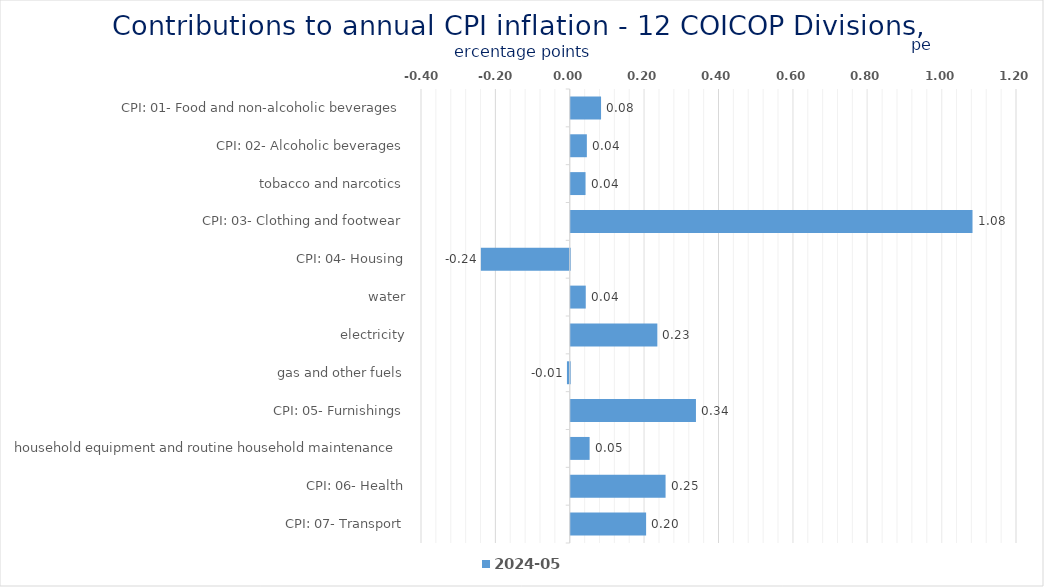
| Category | 2024-05 |
|---|---|
| CPI: 01- Food and non-alcoholic beverages | 0.081 |
| CPI: 02- Alcoholic beverages, tobacco and narcotics | 0.043 |
| CPI: 03- Clothing and footwear | 0.04 |
| CPI: 04- Housing, water, electricity, gas and other fuels | 1.08 |
| CPI: 05- Furnishings, household equipment and routine household maintenance | -0.239 |
| CPI: 06- Health | 0.04 |
| CPI: 07- Transport | 0.233 |
| CPI: 08- Communication | -0.008 |
| CPI: 09- Recreation and culture | 0.337 |
| CPI: 10- Education | 0.051 |
| CPI: 11- Restaurants and hotels | 0.255 |
| CPI: 12- Miscellaneous goods and services | 0.203 |